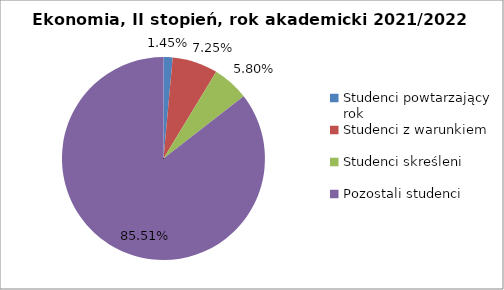
| Category | Series 0 |
|---|---|
| Studenci powtarzający rok | 1 |
| Studenci z warunkiem | 5 |
| Studenci skreśleni | 4 |
| Pozostali studenci | 59 |